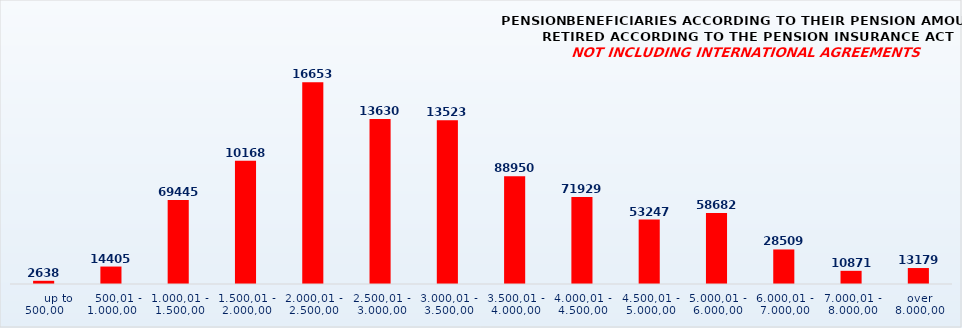
| Category | PENSION BENEFICIARIES ACCORDING TO TYPES AND AMOUNTS OF PENSION, RETIRED ACCORDING TO THE PENSION INSURANCE ACT
NOT INCLUDING INTERNATIONAL AGREEMENTS |
|---|---|
|       up to 500,00 | 2638 |
|    500,01 - 1.000,00 | 14405 |
| 1.000,01 - 1.500,00 | 69445 |
| 1.500,01 - 2.000,00 | 101681 |
| 2.000,01 - 2.500,00 | 166534 |
| 2.500,01 - 3.000,00 | 136302 |
| 3.000,01 - 3.500,00 | 135232 |
| 3.500,01 - 4.000,00 | 88950 |
| 4.000,01 - 4.500,00 | 71929 |
| 4.500,01 - 5.000,00 | 53247 |
| 5.000,01 - 6.000,00 | 58682 |
| 6.000,01 - 7.000,00 | 28509 |
| 7.000,01 - 8.000,00 | 10871 |
|  over  8.000,00 | 13179 |